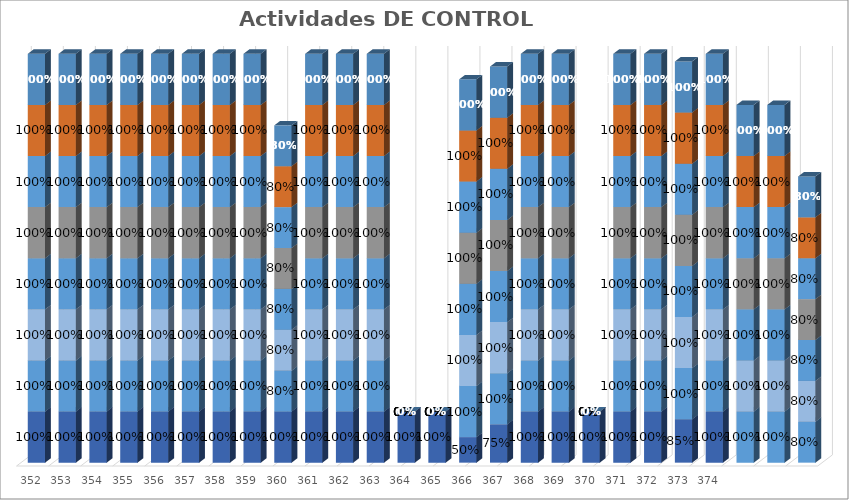
| Category | % Avance |
|---|---|
| 352.0 | 1 |
| 353.0 | 1 |
| 354.0 | 1 |
| 355.0 | 1 |
| 356.0 | 1 |
| 357.0 | 1 |
| 358.0 | 1 |
| 359.0 | 1 |
| 360.0 | 0.8 |
| 361.0 | 1 |
| 362.0 | 1 |
| 363.0 | 1 |
| 364.0 | 0 |
| 365.0 | 0 |
| 366.0 | 1 |
| 367.0 | 1 |
| 368.0 | 1 |
| 369.0 | 1 |
| 370.0 | 0 |
| 371.0 | 1 |
| 372.0 | 1 |
| 373.0 | 1 |
| 374.0 | 1 |